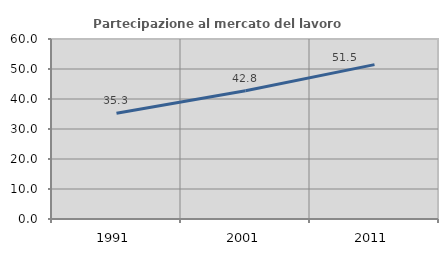
| Category | Partecipazione al mercato del lavoro  femminile |
|---|---|
| 1991.0 | 35.254 |
| 2001.0 | 42.778 |
| 2011.0 | 51.455 |